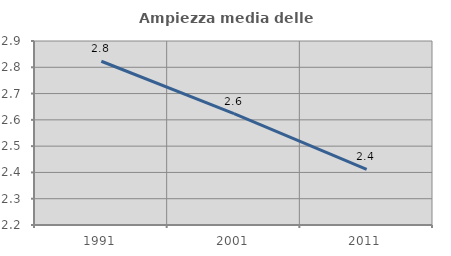
| Category | Ampiezza media delle famiglie |
|---|---|
| 1991.0 | 2.823 |
| 2001.0 | 2.623 |
| 2011.0 | 2.411 |